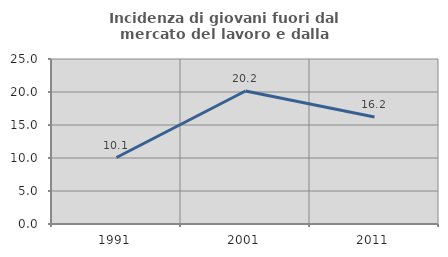
| Category | Incidenza di giovani fuori dal mercato del lavoro e dalla formazione  |
|---|---|
| 1991.0 | 10.074 |
| 2001.0 | 20.153 |
| 2011.0 | 16.216 |